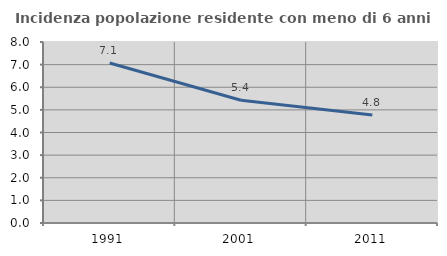
| Category | Incidenza popolazione residente con meno di 6 anni |
|---|---|
| 1991.0 | 7.071 |
| 2001.0 | 5.428 |
| 2011.0 | 4.773 |